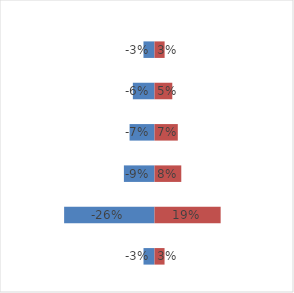
| Category | Femme | Homme |
|---|---|---|
| 60+ | -0.032 | 0.029 |
| 18-59 ans | -0.263 | 0.192 |
| 13-17 ans | -0.089 | 0.078 |
| 6-12 ans | -0.073 | 0.068 |
| 1-5 ans | -0.063 | 0.052 |
| Moins 1 an | -0.032 | 0.029 |